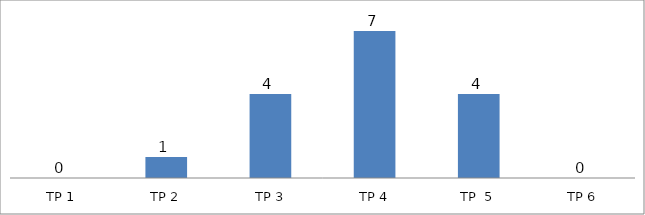
| Category | BIL. MURID |
|---|---|
| TP 1 | 0 |
| TP 2 | 1 |
|  TP 3 | 4 |
| TP 4 | 7 |
| TP  5 | 4 |
| TP 6 | 0 |